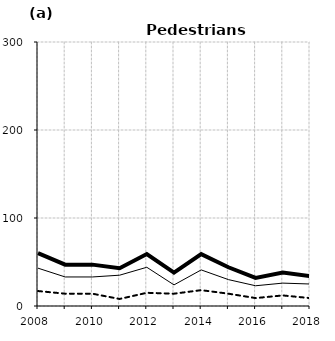
| Category | Built-up | Non built-up | Total |
|---|---|---|---|
| 2008.0 | 43 | 17 | 60 |
| 2009.0 | 33 | 14 | 47 |
| 2010.0 | 33 | 14 | 47 |
| 2011.0 | 35 | 8 | 43 |
| 2012.0 | 44 | 15 | 59 |
| 2013.0 | 24 | 14 | 38 |
| 2014.0 | 41 | 18 | 59 |
| 2015.0 | 30 | 14 | 44 |
| 2016.0 | 23 | 9 | 32 |
| 2017.0 | 26 | 12 | 38 |
| 2018.0 | 25 | 9 | 34 |